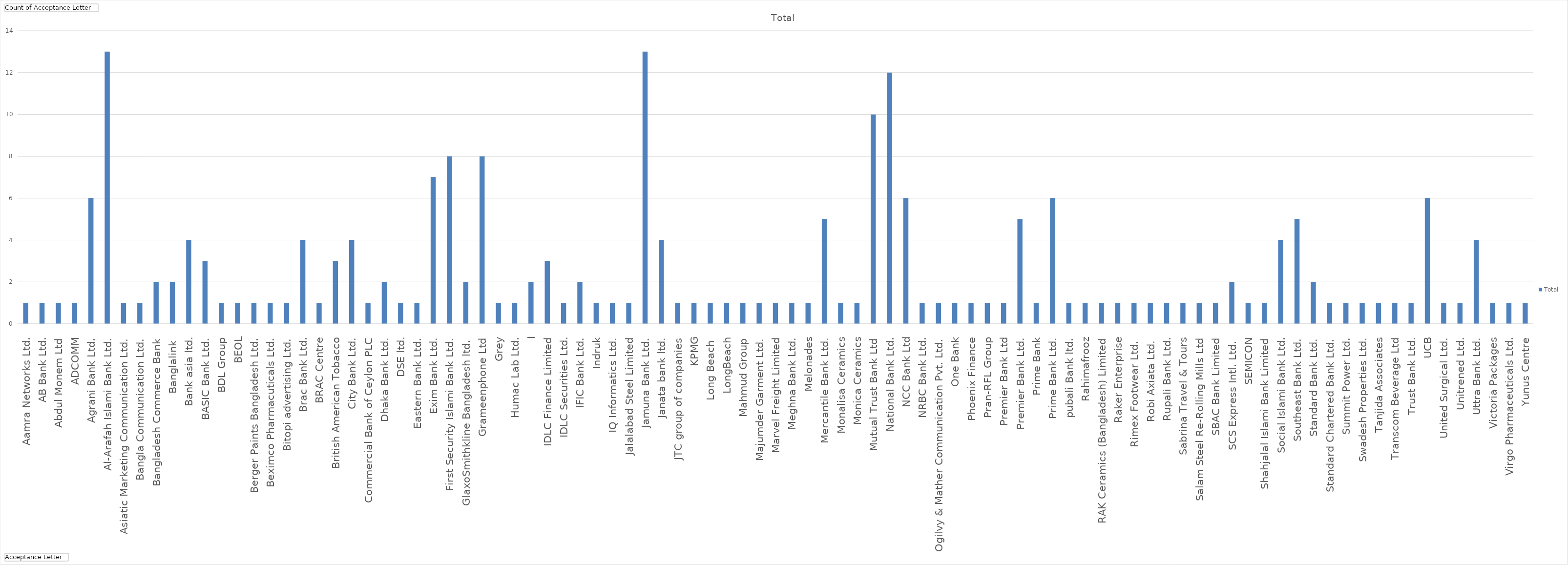
| Category | Total |
|---|---|
| Aamra Networks Ltd. | 1 |
| AB Bank Ltd. | 1 |
| Abdul Monem Ltd | 1 |
| ADCOMM | 1 |
| Agrani Bank Ltd. | 6 |
| Al-Arafah Islami Bank Ltd. | 13 |
| Asiatic Marketing Communication Ltd. | 1 |
| Bangla Communication Ltd. | 1 |
| Bangladesh Commerce Bank | 2 |
| Banglalink  | 2 |
| Bank asia ltd. | 4 |
| BASIC Bank Ltd. | 3 |
| BDL Group | 1 |
| BEOL | 1 |
| Berger Paints Bangladesh Ltd. | 1 |
| Beximco Pharmacuticals Ltd. | 1 |
| Bitopi advertising Ltd. | 1 |
| Brac Bank Ltd. | 4 |
| BRAC Centre | 1 |
| British American Tobacco | 3 |
| City Bank Ltd. | 4 |
| Commercial Bank of Ceylon PLC | 1 |
| Dhaka Bank Ltd. | 2 |
| DSE ltd. | 1 |
| Eastern Bank Ltd. | 1 |
| Exim Bank Ltd. | 7 |
| First Security Islami Bank Ltd. | 8 |
| GlaxoSmithkline Bangladesh ltd. | 2 |
| Grameenphone Ltd | 8 |
| Grey | 1 |
| Humac Lab Ltd. | 1 |
| I | 2 |
| IDLC Finance Limited | 3 |
| IDLC Securities Ltd. | 1 |
| IFIC Bank Ltd. | 2 |
| Indruk | 1 |
| IQ Informatics Ltd. | 1 |
| Jalalabad Steel Limited | 1 |
| Jamuna Bank Ltd. | 13 |
| Janata bank ltd. | 4 |
| JTC group of companies | 1 |
| KPMG | 1 |
| Long Beach  | 1 |
| LongBeach | 1 |
| Mahmud Group | 1 |
| Majumder Garment Ltd. | 1 |
| Marvel Freight Limited | 1 |
| Meghna Bank Ltd. | 1 |
| Melonades | 1 |
| Mercantile Bank Ltd. | 5 |
| Monalisa Ceramics | 1 |
| Monica Ceramics | 1 |
| Mutual Trust Bank Ltd | 10 |
| National Bank Ltd. | 12 |
| NCC Bank Ltd | 6 |
| NRBC Bank Ltd. | 1 |
| Ogilvy & Mather Communication Pvt. Ltd. | 1 |
| One Bank | 1 |
| Phoenix Finance | 1 |
| Pran-RFL Group | 1 |
| Premier Bank Ltd | 1 |
| Premier Bank Ltd. | 5 |
| Prime Bank | 1 |
| Prime Bank Ltd. | 6 |
| pubali Bank ltd. | 1 |
| Rahimafrooz | 1 |
| RAK Ceramics (Bangladesh) Limited | 1 |
| Raker Enterprise | 1 |
| Rimex Footwear Ltd.  | 1 |
| Robi Axiata Ltd.  | 1 |
| Rupali Bank Ltd. | 1 |
| Sabrina Travel & Tours | 1 |
| Salam Steel Re-Rolling Mills Ltd | 1 |
| SBAC Bank Limited | 1 |
| SCS Express Intl. Ltd.  | 2 |
| SEMICON | 1 |
| Shahjalal Islami Bank Limited | 1 |
| Social Islami Bank Ltd. | 4 |
| Southeast Bank Ltd. | 5 |
| Standard Bank Ltd. | 2 |
| Standard Chartered Bank Ltd. | 1 |
| Summit Power Ltd. | 1 |
| Swadesh Properties Ltd. | 1 |
| Tanjida Associates | 1 |
| Transcom Beverage Ltd | 1 |
| Trust Bank Ltd. | 1 |
| UCB | 6 |
| United Surgical Ltd. | 1 |
| Unitrened Ltd. | 1 |
| Uttra Bank Ltd. | 4 |
| Victoria Packages | 1 |
| Virgo Pharmaceuticals Ltd. | 1 |
| Yunus Centre | 1 |